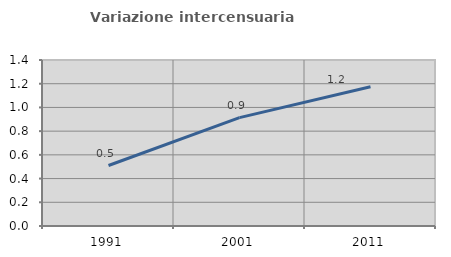
| Category | Variazione intercensuaria annua |
|---|---|
| 1991.0 | 0.51 |
| 2001.0 | 0.914 |
| 2011.0 | 1.174 |